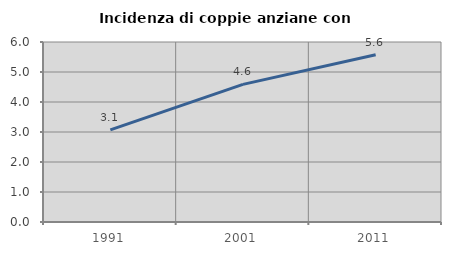
| Category | Incidenza di coppie anziane con figli |
|---|---|
| 1991.0 | 3.069 |
| 2001.0 | 4.589 |
| 2011.0 | 5.574 |